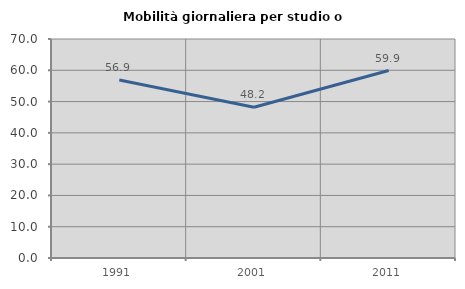
| Category | Mobilità giornaliera per studio o lavoro |
|---|---|
| 1991.0 | 56.881 |
| 2001.0 | 48.207 |
| 2011.0 | 59.925 |